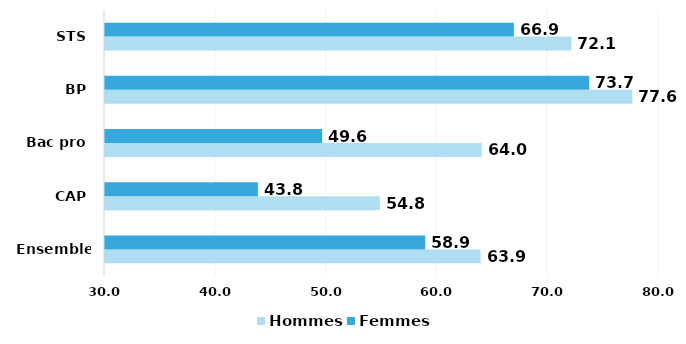
| Category | Hommes | Femmes |
|---|---|---|
| Ensemble* | 63.9 | 58.9 |
| CAP | 54.8 | 43.8 |
| Bac pro | 64 | 49.6 |
| BP | 77.6 | 73.7 |
| STS | 72.1 | 66.9 |